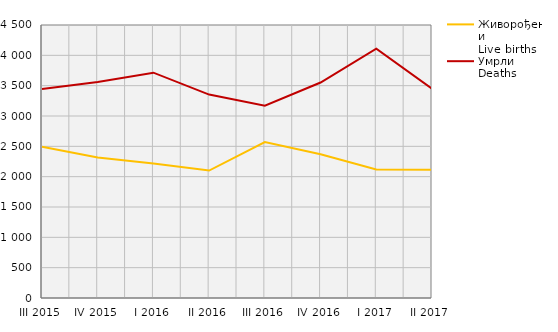
| Category | Живорођени
Live births | Умрли
Deaths |
|---|---|---|
| III 2015 | 2492 | 3444 |
| IV 2015 | 2315 | 3560 |
| I 2016 | 2216 | 3714 |
| II 2016 | 2101 | 3353 |
| III 2016 | 2570 | 3171 |
| IV 2016 | 2369 | 3552 |
| I 2017 | 2118 | 4111 |
| II 2017 | 2116 | 3448 |